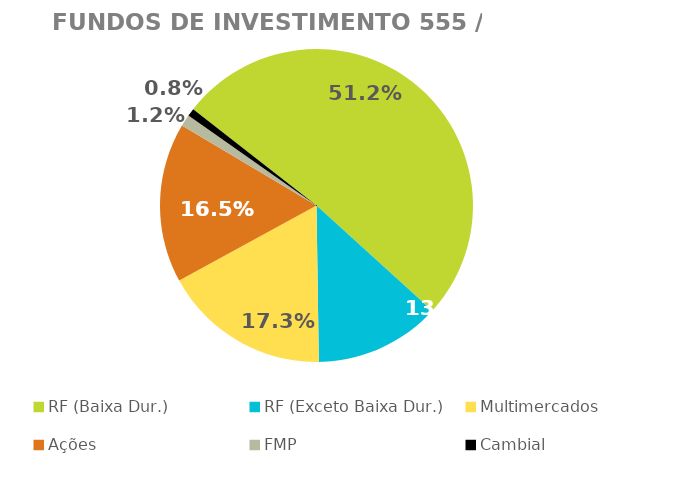
| Category | Fundos de Investimento 555 / FMP |
|---|---|
| RF (Baixa Dur.) | 0.512 |
| RF (Exceto Baixa Dur.) | 0.13 |
| Multimercados | 0.173 |
| Ações | 0.165 |
| FMP | 0.012 |
| Cambial | 0.008 |